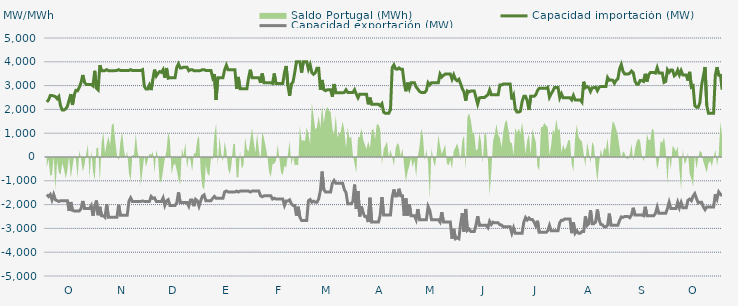
| Category | Capacidad importación (MW) | Capacidad exportación (MW) |
|---|---|---|
| 0 | 2310.417 | -1575 |
| 1900-01-01 | 2400 | -1658.333 |
| 1900-01-02 | 2583.333 | -1575 |
| 1900-01-03 | 2583.333 | -1800 |
| 1900-01-04 | 2562.5 | -1575 |
| 1900-01-05 | 2537.5 | -1800 |
| 1900-01-06 | 2450 | -1833.333 |
| 1900-01-07 | 2541.667 | -1870.833 |
| 1900-01-08 | 2150 | -1833.333 |
| 1900-01-09 | 1975 | -1833.333 |
| 1900-01-10 | 1975 | -1833.333 |
| 1900-01-11 | 2020.833 | -1833.333 |
| 1900-01-12 | 2125 | -1833.333 |
| 1900-01-13 | 2387.5 | -2266.667 |
| 1900-01-14 | 2639.583 | -1891.667 |
| 1900-01-15 | 2187.5 | -2243.75 |
| 1900-01-16 | 2610.417 | -2266.667 |
| 1900-01-17 | 2800 | -2266.667 |
| 1900-01-18 | 2783.333 | -2266.667 |
| 1900-01-19 | 2931.25 | -2266.667 |
| 1900-01-20 | 3125 | -2166.667 |
| 1900-01-21 | 3445.833 | -1847.917 |
| 1900-01-22 | 3137.5 | -2166.667 |
| 1900-01-23 | 3050 | -2166.667 |
| 1900-01-24 | 3050 | -2166.667 |
| 1900-01-25 | 3050 | -2166.667 |
| 1900-01-26 | 3050 | -2041.667 |
| 1900-01-27 | 2987.5 | -2466.667 |
| 1900-01-28 | 3622 | -2080 |
| 1900-01-29 | 2887.5 | -1829.167 |
| 1900-01-30 | 2816.667 | -2445.833 |
| 1900-01-31 | 3854.167 | -2091.667 |
| 1900-02-01 | 3625 | -2466.667 |
| 1900-02-02 | 3625 | -2466.667 |
| 1900-02-03 | 3629.167 | -2533.333 |
| 1900-02-04 | 3670.833 | -1987.5 |
| 1900-02-05 | 3629.167 | -2533.333 |
| 1900-02-06 | 3629.167 | -2533.333 |
| 1900-02-07 | 3629.167 | -2533.333 |
| 1900-02-08 | 3629.167 | -2533.333 |
| 1900-02-09 | 3629.167 | -2533.333 |
| 1900-02-10 | 3633.333 | -2533.333 |
| 1900-02-11 | 3670.833 | -2008.333 |
| 1900-02-12 | 3633.333 | -2450 |
| 1900-02-13 | 3633.333 | -2450 |
| 1900-02-14 | 3633.333 | -2450 |
| 1900-02-15 | 3633.333 | -2450 |
| 1900-02-16 | 3633.333 | -2450 |
| 1900-02-17 | 3633.333 | -1866.667 |
| 1900-02-18 | 3670.833 | -1716.667 |
| 1900-02-19 | 3633.333 | -1866.667 |
| 1900-02-20 | 3633.333 | -1866.667 |
| 1900-02-21 | 3633.333 | -1866.667 |
| 1900-02-22 | 3633.333 | -1866.667 |
| 1900-02-23 | 3633.333 | -1866.667 |
| 1900-02-24 | 3633.333 | -1866.667 |
| 1900-02-25 | 3670.833 | -1845.833 |
| 1900-02-26 | 2966.667 | -1866.667 |
| 1900-02-27 | 2858.333 | -1866.667 |
| 1900-02-28 | 2858.333 | -1866.667 |
| 1900-02-28 | 3025 | -1866.667 |
| 1900-03-01 | 2812.5 | -1658.333 |
| 1900-03-02 | 3262.5 | -1737.5 |
| 1900-03-03 | 3670.833 | -1716.667 |
| 1900-03-04 | 3404.167 | -1866.667 |
| 1900-03-05 | 3512.5 | -1866.667 |
| 1900-03-06 | 3589.583 | -1866.667 |
| 1900-03-07 | 3556.25 | -1866.667 |
| 1900-03-08 | 3670.833 | -1716.667 |
| 1900-03-09 | 3329.167 | -2033.333 |
| 1900-03-10 | 3737.5 | -1845.833 |
| 1900-03-11 | 3310.417 | -1791.667 |
| 1900-03-12 | 3329.167 | -2033.333 |
| 1900-03-13 | 3329.167 | -2033.333 |
| 1900-03-14 | 3329.167 | -2033.333 |
| 1900-03-15 | 3329.167 | -2033.333 |
| 1900-03-16 | 3775 | -1916.667 |
| 1900-03-17 | 3912.5 | -1485.417 |
| 1900-03-18 | 3743.75 | -1916.667 |
| 1900-03-19 | 3743.75 | -1916.667 |
| 1900-03-20 | 3775 | -1916.667 |
| 1900-03-21 | 3775 | -1916.667 |
| 1900-03-22 | 3775 | -1916.667 |
| 1900-03-23 | 3625 | -2066.667 |
| 1900-03-24 | 3670.833 | -1804.167 |
| 1900-03-25 | 3670.833 | -1804.167 |
| 1900-03-26 | 3625 | -2066.667 |
| 1900-03-27 | 3625 | -1779.167 |
| 1900-03-28 | 3625 | -1841.667 |
| 1900-03-29 | 3625 | -2066.667 |
| 1900-03-30 | 3633.333 | -1833.333 |
| 1900-03-31 | 3670.833 | -1645.833 |
| 1900-04-01 | 3670.833 | -1591.667 |
| 1900-04-02 | 3633.333 | -1833.333 |
| 1900-04-03 | 3633.333 | -1833.333 |
| 1900-04-04 | 3633.333 | -1833.333 |
| 1900-04-05 | 3633.333 | -1833.333 |
| 1900-04-06 | 3333.333 | -1733.333 |
| 1900-04-07 | 3483.333 | -1658.333 |
| 1900-04-08 | 2393.75 | -1733.333 |
| 1900-04-09 | 3333.333 | -1733.333 |
| 1900-04-10 | 3333.333 | -1733.333 |
| 1900-04-11 | 3333.333 | -1733.333 |
| 1900-04-12 | 3333.333 | -1733.333 |
| 1900-04-13 | 3662.5 | -1466.667 |
| 1900-04-14 | 3854.167 | -1429.167 |
| 1900-04-15 | 3662.5 | -1466.667 |
| 1900-04-16 | 3662.5 | -1466.667 |
| 1900-04-17 | 3662.5 | -1466.667 |
| 1900-04-18 | 3662.5 | -1466.667 |
| 1900-04-19 | 3662.5 | -1466.667 |
| 1900-04-20 | 2862.5 | -1433.333 |
| 1900-04-21 | 3364.583 | -1470.833 |
| 1900-04-22 | 2862.5 | -1433.333 |
| 1900-04-23 | 2862.5 | -1433.333 |
| 1900-04-24 | 2862.5 | -1433.333 |
| 1900-04-25 | 2862.5 | -1433.333 |
| 1900-04-26 | 2862.5 | -1433.333 |
| 1900-04-27 | 3333.333 | -1433.333 |
| 1900-04-28 | 3666.667 | -1470.833 |
| 1900-04-29 | 3333.333 | -1433.333 |
| 1900-04-30 | 3333.333 | -1433.333 |
| 1900-05-01 | 3333.333 | -1433.333 |
| 1900-05-02 | 3333.333 | -1433.333 |
| 1900-05-03 | 3333.333 | -1433.333 |
| 1900-05-04 | 3116.667 | -1633.333 |
| 1900-05-05 | 3508.333 | -1670.833 |
| 1900-05-06 | 3116.667 | -1633.333 |
| 1900-05-07 | 3116.667 | -1633.333 |
| 1900-05-08 | 3116.667 | -1633.333 |
| 1900-05-09 | 3116.667 | -1633.333 |
| 1900-05-10 | 3116.667 | -1633.333 |
| 1900-05-11 | 3087.5 | -1766.667 |
| 1900-05-12 | 3508.333 | -1729.167 |
| 1900-05-13 | 3087.5 | -1766.667 |
| 1900-05-14 | 3087.5 | -1766.667 |
| 1900-05-15 | 3087.5 | -1766.667 |
| 1900-05-16 | 3087.5 | -1766.667 |
| 1900-05-17 | 3087.5 | -1766.667 |
| 1900-05-18 | 3550 | -2033.333 |
| 1900-05-19 | 3825 | -1845.833 |
| 1900-05-20 | 2987.5 | -1845.833 |
| 1900-05-21 | 2575 | -1800 |
| 1900-05-22 | 3062.5 | -1962.5 |
| 1900-05-23 | 3154.167 | -2033.333 |
| 1900-05-24 | 3550 | -2033.333 |
| 1900-05-25 | 4000 | -2466.667 |
| 1900-05-26 | 4000 | -2091.667 |
| 1900-05-27 | 4000 | -2529.167 |
| 1900-05-28 | 3545.833 | -2666.667 |
| 1900-05-29 | 4000 | -2666.667 |
| 1900-05-30 | 4000 | -2666.667 |
| 1900-05-31 | 4000 | -2666.667 |
| 1900-06-01 | 3691.667 | -1837.5 |
| 1900-06-02 | 3883.333 | -1787.5 |
| 1900-06-03 | 3545.833 | -1900 |
| 1900-06-04 | 3475 | -1854.167 |
| 1900-06-05 | 3537.5 | -1900 |
| 1900-06-06 | 3733.333 | -1900 |
| 1900-06-07 | 3733.333 | -1762.5 |
| 1900-06-08 | 2825 | -1416.667 |
| 1900-06-09 | 3237.5 | -612.5 |
| 1900-06-10 | 2825 | -1370.833 |
| 1900-06-11 | 2787.5 | -1466.667 |
| 1900-06-12 | 2825 | -1466.667 |
| 1900-06-13 | 2825 | -1466.667 |
| 1900-06-14 | 2825 | -1466.667 |
| 1900-06-15 | 2529.167 | -1100 |
| 1900-06-16 | 3066.667 | -987.5 |
| 1900-06-17 | 2700 | -1100 |
| 1900-06-18 | 2700 | -1100 |
| 1900-06-19 | 2700 | -1100 |
| 1900-06-20 | 2700 | -1100 |
| 1900-06-21 | 2700 | -1100 |
| 1900-06-22 | 2712.5 | -1368.75 |
| 1900-06-23 | 2823.913 | -1495.652 |
| 1900-06-24 | 2712.5 | -1966.667 |
| 1900-06-25 | 2712.5 | -1966.667 |
| 1900-06-26 | 2712.5 | -1966.667 |
| 1900-06-27 | 2712.5 | -1862.5 |
| 1900-06-28 | 2827.083 | -1160.417 |
| 1900-06-29 | 2645.833 | -2179.167 |
| 1900-06-30 | 2487.5 | -1427.083 |
| 1900-07-01 | 2639.583 | -2495.833 |
| 1900-07-02 | 2633.333 | -2079.167 |
| 1900-07-03 | 2633.333 | -2350 |
| 1900-07-04 | 2633.333 | -2500 |
| 1900-07-05 | 2633.333 | -2500 |
| 1900-07-06 | 2212.5 | -2733.333 |
| 1900-07-07 | 2495.833 | -1712.5 |
| 1900-07-08 | 2212.5 | -2733.333 |
| 1900-07-09 | 2212.5 | -2725 |
| 1900-07-10 | 2212.5 | -2733.333 |
| 1900-07-11 | 2212.5 | -2733.333 |
| 1900-07-12 | 2212.5 | -2733.333 |
| 1900-07-13 | 2150 | -2433.333 |
| 1900-07-14 | 2241.667 | -1683.333 |
| 1900-07-15 | 1883.333 | -2433.333 |
| 1900-07-16 | 1837.5 | -2433.333 |
| 1900-07-17 | 1837.5 | -2433.333 |
| 1900-07-18 | 1837.5 | -2433.333 |
| 1900-07-19 | 1987.5 | -2433.333 |
| 1900-07-20 | 3754.167 | -1700 |
| 1900-07-21 | 3870.833 | -1362.5 |
| 1900-07-22 | 3704.167 | -1637.5 |
| 1900-07-23 | 3687.5 | -1633.333 |
| 1900-07-24 | 3743.75 | -1333.333 |
| 1900-07-25 | 3687.5 | -1633.333 |
| 1900-07-26 | 3687.5 | -1633.333 |
| 1900-07-27 | 3125 | -2466.667 |
| 1900-07-28 | 2762.5 | -1741.667 |
| 1900-07-29 | 3125 | -2466.667 |
| 1900-07-30 | 2881.25 | -1979.167 |
| 1900-07-31 | 3125 | -2466.667 |
| 1900-08-01 | 3125 | -2466.667 |
| 1900-08-02 | 3125 | -2466.667 |
| 1900-08-03 | 2941.667 | -2633.333 |
| 1900-08-04 | 2852.083 | -2187.5 |
| 1900-08-05 | 2752.083 | -2633.333 |
| 1900-08-06 | 2712.5 | -2633.333 |
| 1900-08-07 | 2712.5 | -2633.333 |
| 1900-08-08 | 2712.5 | -2633.333 |
| 1900-08-09 | 2795.833 | -2633.333 |
| 1900-08-10 | 3125 | -2079.583 |
| 1900-08-11 | 3029.167 | -2250 |
| 1900-08-12 | 3125 | -2633.333 |
| 1900-08-13 | 3125 | -2633.333 |
| 1900-08-14 | 3125 | -2633.333 |
| 1900-08-15 | 3125 | -2633.333 |
| 1900-08-16 | 3125 | -2633.333 |
| 1900-08-17 | 3483.333 | -2733.333 |
| 1900-08-18 | 3358.333 | -2320.833 |
| 1900-08-19 | 3429.167 | -2733.333 |
| 1900-08-20 | 3483.333 | -2733.333 |
| 1900-08-21 | 3483.333 | -2733.333 |
| 1900-08-22 | 3483.333 | -2733.333 |
| 1900-08-23 | 3483.333 | -2733.333 |
| 1900-08-24 | 3266.667 | -3433.333 |
| 1900-08-25 | 3454.167 | -3020.833 |
| 1900-08-26 | 3266.667 | -3433.333 |
| 1900-08-27 | 3204.167 | -3391.667 |
| 1900-08-28 | 3266.667 | -3433.333 |
| 1900-08-29 | 3083.333 | -2816.667 |
| 1900-08-30 | 2866.667 | -2362.5 |
| 1900-08-31 | 2737.5 | -3133.333 |
| 1900-09-01 | 2358.333 | -2183.333 |
| 1900-09-02 | 2775 | -3085.417 |
| 1900-09-03 | 2733.333 | -3029.167 |
| 1900-09-04 | 2775 | -3133.333 |
| 1900-09-05 | 2775 | -3133.333 |
| 1900-09-06 | 2775 | -3133.333 |
| 1900-09-07 | 2500 | -2866.667 |
| 1900-09-08 | 2225 | -2491.667 |
| 1900-09-09 | 2481.25 | -2866.667 |
| 1900-09-10 | 2500 | -2866.667 |
| 1900-09-11 | 2500 | -2866.667 |
| 1900-09-12 | 2500 | -2866.667 |
| 1900-09-13 | 2562.5 | -2866.667 |
| 1900-09-14 | 2612.5 | -2966.667 |
| 1900-09-15 | 2818.75 | -2704.167 |
| 1900-09-16 | 2612.5 | -2833.333 |
| 1900-09-17 | 2612.5 | -2737.5 |
| 1900-09-18 | 2612.5 | -2766.667 |
| 1900-09-19 | 2612.5 | -2766.667 |
| 1900-09-20 | 2612.5 | -2766.667 |
| 1900-09-21 | 3025 | -2850 |
| 1900-09-22 | 3029.167 | -2858.333 |
| 1900-09-23 | 3066.667 | -2933.333 |
| 1900-09-24 | 3066.667 | -2933.333 |
| 1900-09-25 | 3066.667 | -2933.333 |
| 1900-09-26 | 3066.667 | -2933.333 |
| 1900-09-27 | 3066.667 | -2933.333 |
| 1900-09-28 | 2416.667 | -3200 |
| 1900-09-29 | 2585.417 | -2975 |
| 1900-09-30 | 2012.5 | -3200 |
| 1900-10-01 | 1887.5 | -3200 |
| 1900-10-02 | 1887.5 | -3200 |
| 1900-10-03 | 1920.833 | -3200 |
| 1900-10-04 | 2333.333 | -3200 |
| 1900-10-05 | 2550 | -2733.333 |
| 1900-10-06 | 2550 | -2545.833 |
| 1900-10-07 | 2362.5 | -2645.833 |
| 1900-10-08 | 1975 | -2558.333 |
| 1900-10-09 | 2550 | -2629.167 |
| 1900-10-10 | 2550 | -2629.167 |
| 1900-10-11 | 2550 | -2729.167 |
| 1900-10-12 | 2616.667 | -2895.833 |
| 1900-10-13 | 2793.75 | -2679.167 |
| 1900-10-14 | 2887.5 | -3166.667 |
| 1900-10-15 | 2887.5 | -3166.667 |
| 1900-10-16 | 2887.5 | -3166.667 |
| 1900-10-17 | 2887.5 | -3166.667 |
| 1900-10-18 | 2887.5 | -3166.667 |
| 1900-10-19 | 2925 | -3100 |
| 1900-10-20 | 2512.5 | -2875 |
| 1900-10-21 | 2658.333 | -3100 |
| 1900-10-22 | 2779.167 | -3100 |
| 1900-10-23 | 2925 | -3100 |
| 1900-10-24 | 2925 | -3100 |
| 1900-10-25 | 2925 | -3100 |
| 1900-10-26 | 2487.5 | -2758.333 |
| 1900-10-27 | 2656.25 | -2658.333 |
| 1900-10-28 | 2487.5 | -2654.167 |
| 1900-10-29 | 2487.5 | -2600 |
| 1900-10-30 | 2487.5 | -2600 |
| 1900-10-31 | 2487.5 | -2600 |
| 1900-11-01 | 2487.5 | -2600 |
| 1900-11-02 | 2400 | -3200 |
| 1900-11-03 | 2583.333 | -2750 |
| 1900-11-04 | 2400 | -3200 |
| 1900-11-05 | 2400 | -3100 |
| 1900-11-06 | 2400 | -3200 |
| 1900-11-07 | 2400 | -3200 |
| 1900-11-08 | 2308.333 | -3133.333 |
| 1900-11-09 | 3162.5 | -3133.333 |
| 1900-11-10 | 2910.417 | -2495.833 |
| 1900-11-11 | 2962.5 | -2875 |
| 1900-11-12 | 2912.5 | -2800 |
| 1900-11-13 | 2752.083 | -2237.5 |
| 1900-11-14 | 2912.5 | -2800 |
| 1900-11-15 | 2912.5 | -2800 |
| 1900-11-16 | 2933.333 | -2733.333 |
| 1900-11-17 | 2787.5 | -2208.333 |
| 1900-11-18 | 2929.167 | -2633.333 |
| 1900-11-19 | 2962.5 | -2829.167 |
| 1900-11-20 | 2962.5 | -2850 |
| 1900-11-21 | 2962.5 | -2933.333 |
| 1900-11-22 | 2962.5 | -2933.333 |
| 1900-11-23 | 3337.5 | -2866.667 |
| 1900-11-24 | 3222.917 | -2379.167 |
| 1900-11-25 | 3237.5 | -2866.667 |
| 1900-11-26 | 3225 | -2866.667 |
| 1900-11-27 | 3095.833 | -2866.667 |
| 1900-11-28 | 3225 | -2866.667 |
| 1900-11-29 | 3281.25 | -2866.667 |
| 1900-11-30 | 3700 | -2666.667 |
| 1900-12-01 | 3883.333 | -2516.667 |
| 1900-12-02 | 3600 | -2537.5 |
| 1900-12-03 | 3487.5 | -2500 |
| 1900-12-04 | 3487.5 | -2500 |
| 1900-12-05 | 3487.5 | -2500 |
| 1900-12-06 | 3518.75 | -2550 |
| 1900-12-07 | 3612.5 | -2433.333 |
| 1900-12-08 | 3543.75 | -2133.333 |
| 1900-12-09 | 3193.75 | -2433.333 |
| 1900-12-10 | 3060.417 | -2433.333 |
| 1900-12-11 | 3059.167 | -2433.333 |
| 1900-12-12 | 3212.5 | -2433.333 |
| 1900-12-13 | 3212.5 | -2433.333 |
| 1900-12-14 | 3175 | -2466.667 |
| 1900-12-15 | 3495.833 | -2091.667 |
| 1900-12-16 | 3166.667 | -2466.667 |
| 1900-12-17 | 3454.167 | -2466.667 |
| 1900-12-18 | 3550 | -2466.667 |
| 1900-12-19 | 3550 | -2466.667 |
| 1900-12-20 | 3550 | -2466.667 |
| 1900-12-21 | 3525 | -2366.667 |
| 1900-12-22 | 3754.167 | -2104.167 |
| 1900-12-23 | 3525 | -2366.667 |
| 1900-12-24 | 3525 | -2366.667 |
| 1900-12-25 | 3525 | -2366.667 |
| 1900-12-26 | 3135 | -2366.667 |
| 1900-12-27 | 3175 | -2366.667 |
| 1900-12-28 | 3666.667 | -2166.667 |
| 1900-12-29 | 3558.333 | -1904.167 |
| 1900-12-30 | 3658.333 | -2166.667 |
| 1900-12-31 | 3650 | -2166.667 |
| 1901-01-01 | 3412.5 | -2166.667 |
| 1901-01-02 | 3475 | -2166.667 |
| 1901-01-03 | 3650 | -1904.167 |
| 1901-01-04 | 3450 | -2133.333 |
| 1901-01-05 | 3633.333 | -1912.5 |
| 1901-01-06 | 3450 | -2133.333 |
| 1901-01-07 | 3450 | -2133.333 |
| 1901-01-08 | 3450 | -2133.333 |
| 1901-01-09 | 3210.417 | -1816.667 |
| 1901-01-10 | 3577.083 | -1766.667 |
| 1901-01-11 | 2937.5 | -1833.333 |
| 1901-01-12 | 2985.417 | -1645.833 |
| 1901-01-13 | 2162.5 | -1541.667 |
| 1901-01-14 | 2087.5 | -1745.833 |
| 1901-01-15 | 2087.5 | -1929.167 |
| 1901-01-16 | 2295.833 | -1900 |
| 1901-01-17 | 3025 | -1900 |
| 1901-01-18 | 3395.833 | -2100 |
| 1901-01-19 | 3781.25 | -2212.5 |
| 1901-01-20 | 2170.833 | -2100 |
| 1901-01-21 | 1837.5 | -2100 |
| 1901-01-22 | 1837.5 | -2100 |
| 1901-01-23 | 1837.5 | -2100 |
| 1901-01-24 | 1837.5 | -2100 |
| 1901-01-25 | 3433.333 | -1566.667 |
| 1901-01-26 | 3776 | -1760 |
| 1901-01-27 | 3433.333 | -1466.667 |
| 1901-01-28 | 3433.333 | -1566.667 |
| 1901-01-29 | 2829.167 | -1633.333 |